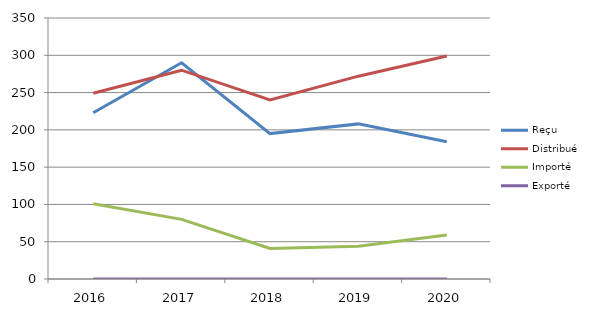
| Category | Reçu | Distribué | Importé | Exporté |
|---|---|---|---|---|
| 2016.0 | 223 | 249 | 101 | 0 |
| 2017.0 | 290 | 280 | 80 | 0 |
| 2018.0 | 195 | 240 | 41 | 0 |
| 2019.0 | 208 | 272 | 44 | 0 |
| 2020.0 | 184 | 299 | 59 | 0 |